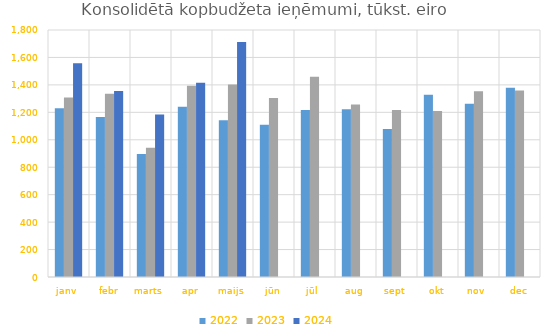
| Category | 2022 | 2023 | 2024 |
|---|---|---|---|
| janv | 1230170.047 | 1307495.685 | 1557359.802 |
| febr | 1166379.907 | 1335076.73 | 1355056.454 |
| marts | 896198.796 | 941933.145 | 1183497.744 |
| apr | 1240480.294 | 1392983.428 | 1415647.644 |
| maijs | 1141583.555 | 1402498.183 | 1711860.245 |
| jūn | 1110073.881 | 1304045.598 | 0 |
| jūl | 1217508.617 | 1459749.866 | 0 |
| aug | 1222030.584 | 1257876.494 | 0 |
| sept | 1079167.695 | 1217869.498 | 0 |
| okt | 1328712.607 | 1209805.903 | 0 |
| nov | 1261934.438 | 1354090.244 | 0 |
| dec | 1379607.658 | 1358321.803 | 0 |